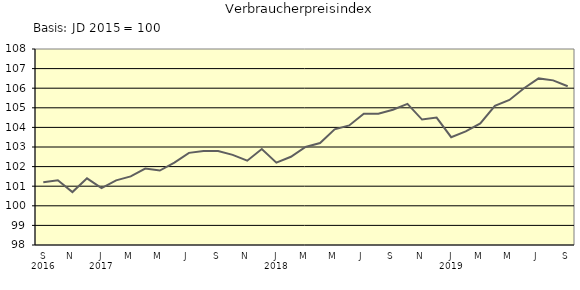
| Category | Series 0 |
|---|---|
| 0 | 101.2 |
| 1 | 101.3 |
| 2 | 100.7 |
| 3 | 101.4 |
| 4 | 100.9 |
| 5 | 101.3 |
| 6 | 101.5 |
| 7 | 101.9 |
| 8 | 101.8 |
| 9 | 102.2 |
| 10 | 102.7 |
| 11 | 102.8 |
| 12 | 102.8 |
| 13 | 102.6 |
| 14 | 102.3 |
| 15 | 102.9 |
| 16 | 102.2 |
| 17 | 102.5 |
| 18 | 103 |
| 19 | 103.2 |
| 20 | 103.9 |
| 21 | 104.1 |
| 22 | 104.7 |
| 23 | 104.7 |
| 24 | 104.9 |
| 25 | 105.2 |
| 26 | 104.4 |
| 27 | 104.5 |
| 28 | 103.5 |
| 29 | 103.8 |
| 30 | 104.2 |
| 31 | 105.1 |
| 32 | 105.4 |
| 33 | 106 |
| 34 | 106.5 |
| 35 | 106.4 |
| 36 | 106.1 |